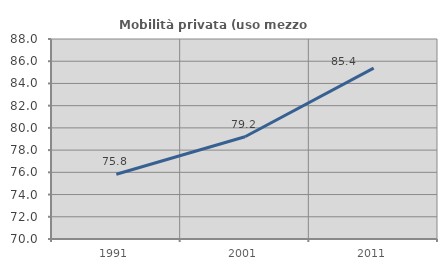
| Category | Mobilità privata (uso mezzo privato) |
|---|---|
| 1991.0 | 75.824 |
| 2001.0 | 79.205 |
| 2011.0 | 85.374 |